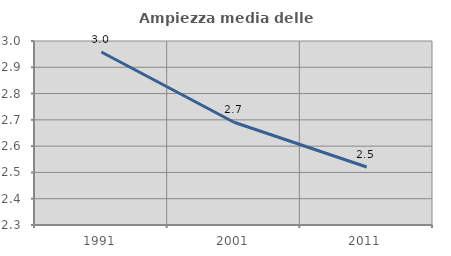
| Category | Ampiezza media delle famiglie |
|---|---|
| 1991.0 | 2.958 |
| 2001.0 | 2.691 |
| 2011.0 | 2.521 |